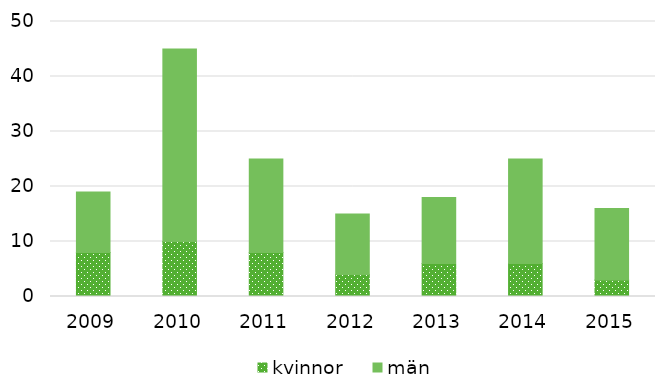
| Category | kvinnor | män |
|---|---|---|
| 2009.0 | 8 | 11 |
| 2010.0 | 10 | 35 |
| 2011.0 | 8 | 17 |
| 2012.0 | 4 | 11 |
| 2013.0 | 6 | 12 |
| 2014.0 | 6 | 19 |
| 2015.0 | 3 | 13 |